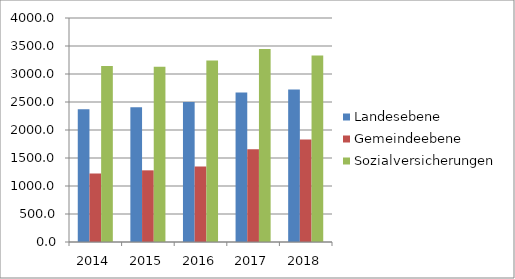
| Category | Landesebene | Gemeindeebene | Sozialversicherungen |
|---|---|---|---|
| 2014.0 | 2368.6 | 1222.7 | 3144 |
| 2015.0 | 2408 | 1279.6 | 3130.7 |
| 2016.0 | 2500.4 | 1347.9 | 3243 |
| 2017.0 | 2671.1 | 1655.8 | 3447 |
| 2018.0 | 2724.3 | 1831.8 | 3330.9 |